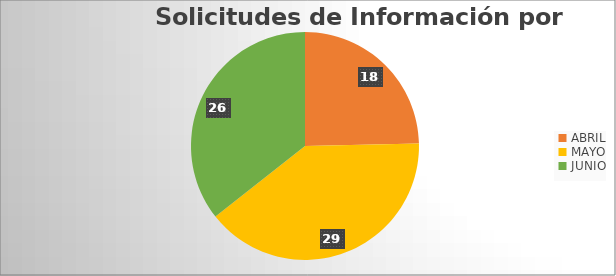
| Category | Series 0 |
|---|---|
| ABRIL | 18 |
| MAYO | 29 |
| JUNIO | 26 |